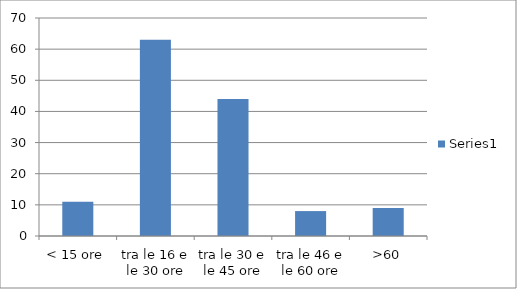
| Category | Series 0 |
|---|---|
| < 15 ore | 11 |
| tra le 16 e le 30 ore | 63 |
| tra le 30 e le 45 ore | 44 |
| tra le 46 e le 60 ore | 8 |
| >60 | 9 |